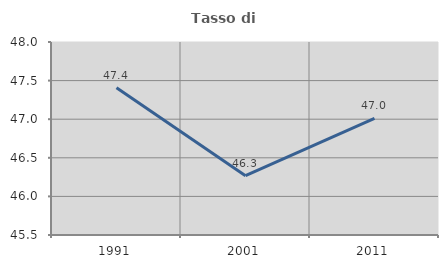
| Category | Tasso di occupazione   |
|---|---|
| 1991.0 | 47.407 |
| 2001.0 | 46.269 |
| 2011.0 | 47.01 |